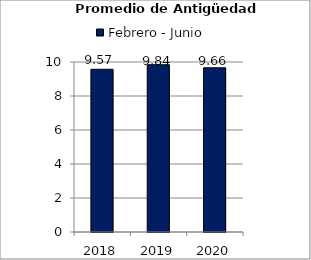
| Category | Febrero - Junio |
|---|---|
| 2018.0 | 9.57 |
| 2019.0 | 9.84 |
| 2020.0 | 9.66 |